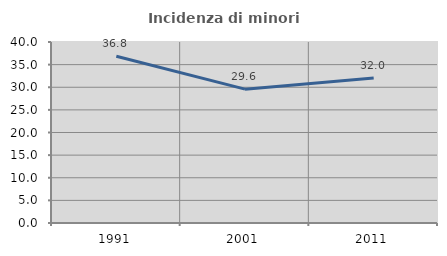
| Category | Incidenza di minori stranieri |
|---|---|
| 1991.0 | 36.842 |
| 2001.0 | 29.577 |
| 2011.0 | 32.023 |